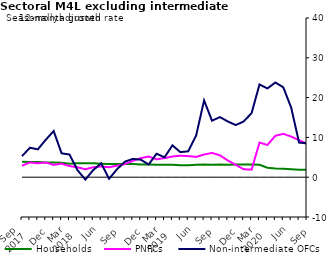
| Category | zero | Households | PNFCs | Non-intermediate OFCs |
|---|---|---|---|---|
| Sep 
2017 | 0 | 3.9 | 2.9 | 5.3 |
|  | 0 | 3.8 | 3.7 | 7.4 |
|  | 0 | 3.8 | 3.5 | 7 |
| Dec | 0 | 3.7 | 3.7 | 9.4 |
|  | 0 | 3.7 | 3.1 | 11.6 |
|  | 0 | 3.6 | 3.4 | 6 |
| Mar 
2018 | 0 | 3.4 | 2.8 | 5.7 |
|  | 0 | 3.5 | 2.5 | 1.8 |
|  | 0 | 3.5 | 2 | -0.6 |
| Jun | 0 | 3.5 | 2.5 | 1.8 |
|  | 0 | 3.4 | 2.7 | 3.5 |
|  | 0 | 3.3 | 2.5 | -0.4 |
| Sep | 0 | 3.3 | 2.9 | 2 |
|  | 0 | 3.3 | 3.3 | 3.9 |
|  | 0 | 3.3 | 4.1 | 4.6 |
| Dec | 0 | 3.2 | 4.8 | 4.4 |
|  | 0 | 3.2 | 5.2 | 3.2 |
|  | 0 | 3.1 | 4.5 | 5.9 |
| Mar 
2019 | 0 | 3.1 | 4.8 | 5 |
|  | 0 | 3.1 | 5.2 | 8 |
|  | 0 | 3 | 5.4 | 6.3 |
| Jun | 0 | 3 | 5.3 | 6.5 |
|  | 0 | 3.1 | 5.1 | 10.5 |
|  | 0 | 3.2 | 5.7 | 19.3 |
| Sep | 0 | 3.1 | 6.1 | 14.2 |
|  | 0 | 3.2 | 5.5 | 15.1 |
|  | 0 | 3.1 | 4.2 | 14 |
| Dec | 0 | 3.2 | 3.1 | 13.1 |
|  | 0 | 3.2 | 2 | 14 |
|  | 0 | 3.2 | 1.9 | 16.1 |
| Mar 
2020 | 0 | 3.1 | 8.7 | 23.3 |
|  | 0 | 2.4 | 8.1 | 22.3 |
|  | 0 | 2.2 | 10.4 | 23.8 |
| Jun | 0 | 2.1 | 10.9 | 22.6 |
|  | 0 | 2 | 10.2 | 17.5 |
|  | 0 | 1.9 | 9.3 | 8.7 |
| Sep | 0 | 1.9 | 8.4 | 8.5 |